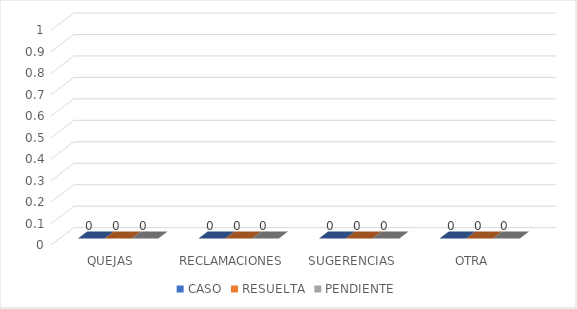
| Category | CASO | RESUELTA | PENDIENTE |
|---|---|---|---|
| QUEJAS | 0 | 0 | 0 |
| RECLAMACIONES | 0 | 0 | 0 |
| SUGERENCIAS | 0 | 0 | 0 |
| OTRA | 0 | 0 | 0 |